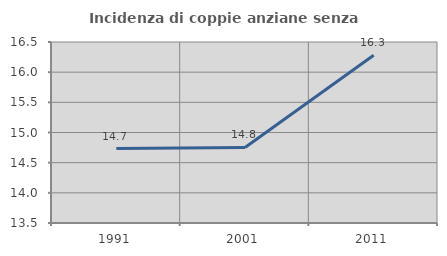
| Category | Incidenza di coppie anziane senza figli  |
|---|---|
| 1991.0 | 14.733 |
| 2001.0 | 14.752 |
| 2011.0 | 16.281 |